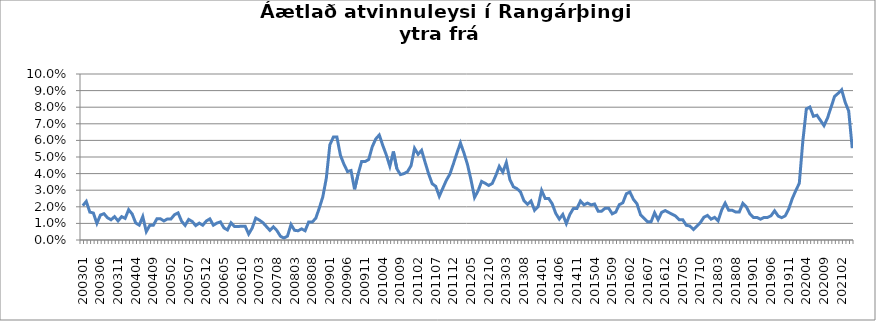
| Category | Series 0 |
|---|---|
| 200301 | 0.021 |
| 200302 | 0.023 |
| 200303 | 0.017 |
| 200304 | 0.016 |
| 200305 | 0.01 |
| 200306 | 0.015 |
| 200307 | 0.016 |
| 200308 | 0.013 |
| 200309 | 0.012 |
| 200310 | 0.014 |
| 200311 | 0.012 |
| 200312 | 0.014 |
| 200401 | 0.013 |
| 200402 | 0.018 |
| 200403 | 0.016 |
| 200404 | 0.01 |
| 200405 | 0.009 |
| 200406 | 0.014 |
| 200407 | 0.005 |
| 200408 | 0.009 |
| 200409 | 0.009 |
| 200410 | 0.013 |
| 200411 | 0.013 |
| 200412 | 0.011 |
| 200501 | 0.013 |
| 200502 | 0.013 |
| 200503 | 0.015 |
| 200504 | 0.016 |
| 200505 | 0.011 |
| 200506 | 0.009 |
| 200507 | 0.012 |
| 200508 | 0.011 |
| 200509 | 0.009 |
| 200510 | 0.01 |
| 200511 | 0.009 |
| 200512 | 0.011 |
| 200601 | 0.013 |
| 200602 | 0.009 |
| 200603 | 0.01 |
| 200604 | 0.011 |
| 200605 | 0.007 |
| 200606 | 0.006 |
| 200607 | 0.01 |
| 200608 | 0.008 |
| 200609 | 0.008 |
| 200610 | 0.008 |
| 200611 | 0.008 |
| 200612 | 0.004 |
| 200701 | 0.007 |
| 200702 | 0.013 |
| 200703 | 0.012 |
| 200704 | 0.011 |
| 200705 | 0.008 |
| 200706 | 0.006 |
| 200707 | 0.008 |
| 200708 | 0.006 |
| 200709 | 0.002 |
| 200710 | 0.001 |
| 200801 | 0.002 |
| 200802 | 0.009 |
| 200803 | 0.006 |
| 200804 | 0.006 |
| 200805 | 0.007 |
| 200806 | 0.006 |
| 200807 | 0.011 |
| 200808 | 0.011 |
| 200809 | 0.013 |
| 200810 | 0.019 |
| 200811 | 0.026 |
| 200812 | 0.037 |
| 200901 | 0.057 |
| 200902 | 0.062 |
| 200903 | 0.062 |
| 200904 | 0.051 |
| 200905 | 0.046 |
| 200906 | 0.041 |
| 200907 | 0.042 |
| 200908 | 0.031 |
| 200909 | 0.04 |
| 200910 | 0.047 |
| 200911 | 0.047 |
| 200912 | 0.048 |
| 201001 | 0.056 |
| 201002 | 0.061 |
| 201003 | 0.063 |
| 201004 | 0.057 |
| 201005 | 0.051 |
| 201006 | 0.044 |
| 201007 | 0.053 |
| 201008 | 0.043 |
| 201009 | 0.039 |
| 201010 | 0.04 |
| 201011 | 0.041 |
| 201012 | 0.045 |
| 201101 | 0.055 |
| 201102 | 0.052 |
| 201103 | 0.054 |
| 201104 | 0.047 |
| 201105 | 0.04 |
| 201106 | 0.034 |
| 201107 | 0.032 |
| 201108 | 0.026 |
| 201109 | 0.031 |
| 201110 | 0.036 |
| 201111 | 0.04 |
| 201112 | 0.046 |
| 201201 | 0.052 |
| 201202 | 0.058 |
| 201203 | 0.052 |
| 201204 | 0.045 |
| 201205 | 0.036 |
| 201206 | 0.026 |
| 201207 | 0.03 |
| 201208 | 0.035 |
| 201209 | 0.034 |
| 201210 | 0.033 |
| 201211 | 0.034 |
| 201212 | 0.039 |
| 201301 | 0.044 |
| 201302 | 0.041 |
| 201303 | 0.047 |
| 201304 | 0.036 |
| 201305 | 0.032 |
| 201306 | 0.031 |
| 201307 | 0.029 |
| 201308 | 0.024 |
| 201309 | 0.022 |
| 201310 | 0.023 |
| 201311 | 0.018 |
| 201312 | 0.02 |
| 201401 | 0.03 |
| 201402 | 0.025 |
| 201403 | 0.025 |
| 201404 | 0.022 |
| 201405 | 0.016 |
| 201406 | 0.013 |
| 201407 | 0.015 |
| 201408 | 0.01 |
| 201409 | 0.015 |
| 201410 | 0.019 |
| 201411 | 0.019 |
| 201412 | 0.023 |
| 201501 | 0.021 |
| 201502 | 0.022 |
| 201503 | 0.021 |
| 201504 | 0.022 |
| 201505 | 0.017 |
| 201506 | 0.017 |
| 201507 | 0.019 |
| 201508 | 0.019 |
| 201509 | 0.016 |
| 201510 | 0.017 |
| 201511 | 0.021 |
| 201512 | 0.022 |
| 201601 | 0.028 |
| 201602 | 0.029 |
| 201603 | 0.024 |
| 201604 | 0.022 |
| 201605 | 0.015 |
| 201606 | 0.013 |
| 201607 | 0.011 |
| 201608 | 0.011 |
| 201609 | 0.016 |
| 201610 | 0.012 |
| 201611 | 0.017 |
| 201612 | 0.018 |
| 201701 | 0.017 |
| 201702 | 0.015 |
| 201703 | 0.014 |
| 201704 | 0.012 |
| 201705 | 0.012 |
| 201706 | 0.009 |
| 201707 | 0.008 |
| 201708 | 0.006 |
| 201709 | 0.008 |
| 201710 | 0.011 |
| 201711 | 0.014 |
| 201712 | 0.015 |
| 201801 | 0.013 |
| 201802 | 0.014 |
| 201803 | 0.012 |
| 201804 | 0.018 |
| 201805 | 0.022 |
| 201806 | 0.018 |
| 201807 | 0.018 |
| 201808 | 0.017 |
| 201809 | 0.017 |
| 201810 | 0.022 |
| 201811 | 0.02 |
| 201812 | 0.016 |
| 201901 | 0.014 |
| 201902 | 0.014 |
| 201903 | 0.013 |
| 201904 | 0.014 |
| 201905 | 0.014 |
| 201906 | 0.015 |
| 201907 | 0.018 |
| 201908 | 0.014 |
| 201909 | 0.013 |
| 201910 | 0.015 |
| 201911 | 0.019 |
| 201912 | 0.025 |
| 202001 | 0.03 |
| 202002 | 0.034 |
| 202003 | 0.059 |
| 202004 | 0.079 |
| 202005 | 0.08 |
| 202006 | 0.075 |
| 202007 | 0.075 |
| 202008 | 0.072 |
| 202009 | 0.069 |
| 202010 | 0.074 |
| 202011 | 0.08 |
| 202012 | 0.086 |
| 202101 | 0.088 |
| 202102 | 0.091 |
| 202103 | 0.083 |
| 202104 | 0.078 |
| 202105 | 0.055 |